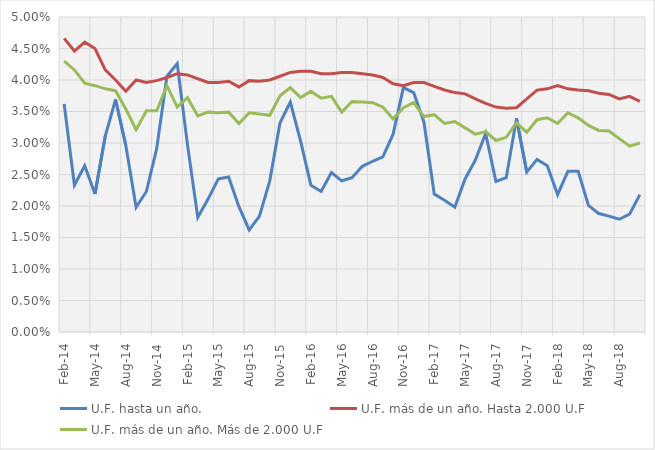
| Category | U.F. hasta un año. | U.F. más de un año. Hasta 2.000 U.F | U.F. más de un año. Más de 2.000 U.F |
|---|---|---|---|
| 2014-02-01 | 0.036 | 0.047 | 0.043 |
| 2014-03-01 | 0.023 | 0.045 | 0.042 |
| 2014-04-01 | 0.026 | 0.046 | 0.04 |
| 2014-05-01 | 0.022 | 0.045 | 0.039 |
| 2014-06-01 | 0.031 | 0.042 | 0.039 |
| 2014-07-01 | 0.037 | 0.04 | 0.038 |
| 2014-08-01 | 0.03 | 0.038 | 0.035 |
| 2014-09-01 | 0.02 | 0.04 | 0.032 |
| 2014-10-01 | 0.022 | 0.04 | 0.035 |
| 2014-11-01 | 0.029 | 0.04 | 0.035 |
| 2014-12-01 | 0.041 | 0.04 | 0.039 |
| 2015-01-01 | 0.043 | 0.041 | 0.036 |
| 2015-02-01 | 0.03 | 0.041 | 0.037 |
| 2015-03-01 | 0.018 | 0.04 | 0.034 |
| 2015-04-01 | 0.021 | 0.04 | 0.035 |
| 2015-05-01 | 0.024 | 0.04 | 0.035 |
| 2015-06-01 | 0.025 | 0.04 | 0.035 |
| 2015-07-01 | 0.02 | 0.039 | 0.033 |
| 2015-08-01 | 0.016 | 0.04 | 0.035 |
| 2015-09-01 | 0.018 | 0.04 | 0.035 |
| 2015-10-01 | 0.024 | 0.04 | 0.034 |
| 2015-11-01 | 0.033 | 0.041 | 0.038 |
| 2015-12-01 | 0.036 | 0.041 | 0.039 |
| 2016-01-01 | 0.03 | 0.041 | 0.037 |
| 2016-02-01 | 0.023 | 0.041 | 0.038 |
| 2016-03-01 | 0.022 | 0.041 | 0.037 |
| 2016-04-01 | 0.025 | 0.041 | 0.037 |
| 2016-05-01 | 0.024 | 0.041 | 0.035 |
| 2016-06-01 | 0.024 | 0.041 | 0.037 |
| 2016-07-01 | 0.026 | 0.041 | 0.036 |
| 2016-08-01 | 0.027 | 0.041 | 0.036 |
| 2016-09-01 | 0.028 | 0.04 | 0.036 |
| 2016-10-01 | 0.031 | 0.039 | 0.034 |
| 2016-11-01 | 0.039 | 0.039 | 0.036 |
| 2016-12-01 | 0.038 | 0.04 | 0.036 |
| 2017-01-01 | 0.033 | 0.04 | 0.034 |
| 2017-02-01 | 0.022 | 0.039 | 0.034 |
| 2017-03-01 | 0.021 | 0.038 | 0.033 |
| 2017-04-01 | 0.02 | 0.038 | 0.033 |
| 2017-05-01 | 0.024 | 0.038 | 0.032 |
| 2017-06-01 | 0.027 | 0.037 | 0.031 |
| 2017-07-01 | 0.032 | 0.036 | 0.032 |
| 2017-08-01 | 0.024 | 0.036 | 0.03 |
| 2017-09-01 | 0.024 | 0.036 | 0.031 |
| 2017-10-01 | 0.034 | 0.036 | 0.033 |
| 2017-11-01 | 0.025 | 0.037 | 0.032 |
| 2017-12-01 | 0.027 | 0.038 | 0.034 |
| 2018-01-01 | 0.026 | 0.039 | 0.034 |
| 2018-02-01 | 0.022 | 0.039 | 0.033 |
| 2018-03-01 | 0.026 | 0.039 | 0.035 |
| 2018-04-01 | 0.026 | 0.038 | 0.034 |
| 2018-05-01 | 0.02 | 0.038 | 0.033 |
| 2018-06-01 | 0.019 | 0.038 | 0.032 |
| 2018-07-01 | 0.018 | 0.038 | 0.032 |
| 2018-08-01 | 0.018 | 0.037 | 0.031 |
| 2018-09-01 | 0.019 | 0.037 | 0.03 |
| 2018-10-01 | 0.022 | 0.037 | 0.03 |